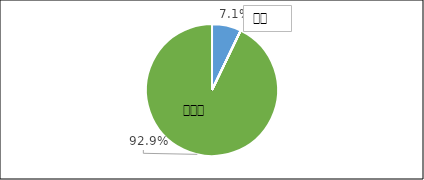
| Category | Series 0 |
|---|---|
| 0 | 0.071 |
| 1 | 0 |
| 2 | 0 |
| 3 | 0 |
| 4 | 0 |
| 5 | 0.929 |